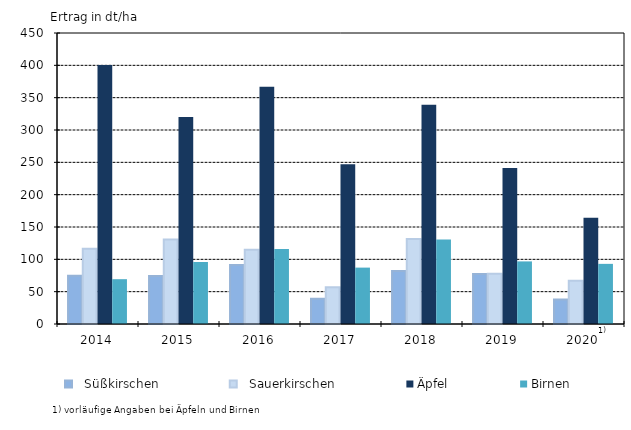
| Category |   Süßkirschen |   Sauerkirschen | Äpfel | Birnen |
|---|---|---|---|---|
| 2014.0 | 74.5 | 116.4 | 400.6 | 69.3 |
| 2015.0 | 74.2 | 130.8 | 320.2 | 95.9 |
| 2016.0 | 91.2 | 114.7 | 366.7 | 116 |
| 2017.0 | 39.1 | 56.7 | 246.9 | 87.2 |
| 2018.0 | 81.9 | 131.6 | 339.1 | 130.7 |
| 2019.0 | 77.2 | 77.7 | 241.3 | 96.8 |
| 2020.0 | 38 | 66.9 | 164.4 | 93 |